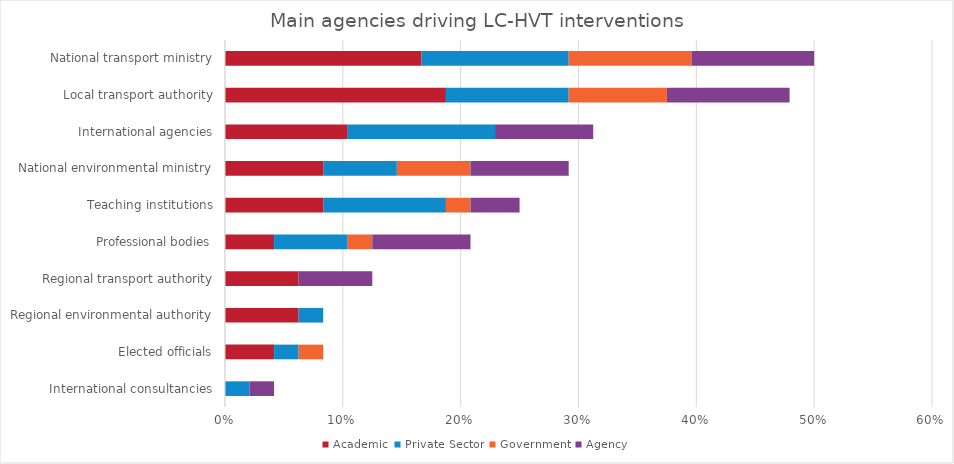
| Category | Academic | Private Sector | Government | Agency |
|---|---|---|---|---|
| International consultancies | 0 | 0.021 | 0 | 0.021 |
| Elected officials | 0.042 | 0.021 | 0.021 | 0 |
| Regional environmental authority | 0.062 | 0.021 | 0 | 0 |
| Regional transport authority | 0.062 | 0 | 0 | 0.062 |
| Professional bodies | 0.042 | 0.062 | 0.021 | 0.083 |
| Teaching institutions | 0.083 | 0.104 | 0.021 | 0.042 |
| National environmental ministry | 0.083 | 0.062 | 0.062 | 0.083 |
| International agencies | 0.104 | 0.125 | 0 | 0.083 |
| Local transport authority | 0.188 | 0.104 | 0.083 | 0.104 |
| National transport ministry | 0.167 | 0.125 | 0.104 | 0.104 |